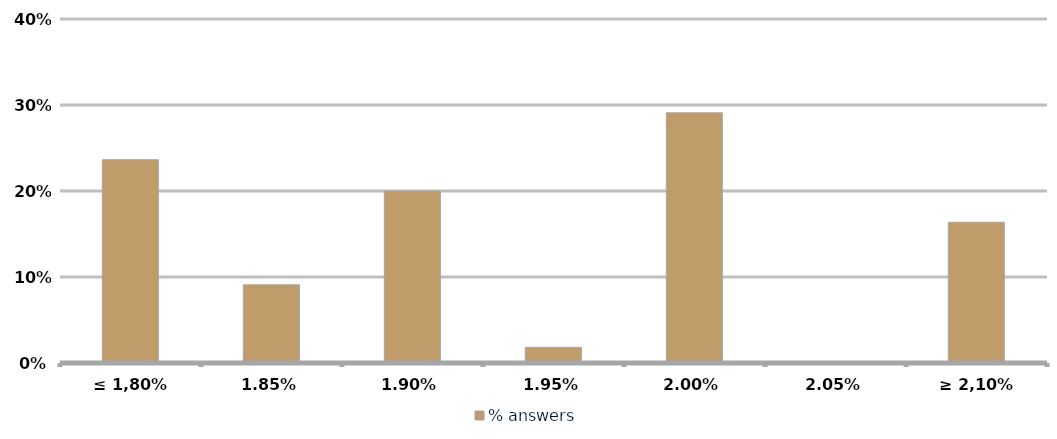
| Category | % answers |
|---|---|
| ≤ 1,80% | 0.236 |
| 1,85% | 0.091 |
| 1,90% | 0.2 |
| 1,95% | 0.018 |
| 2,00% | 0.291 |
| 2,05% | 0 |
| ≥ 2,10% | 0.164 |